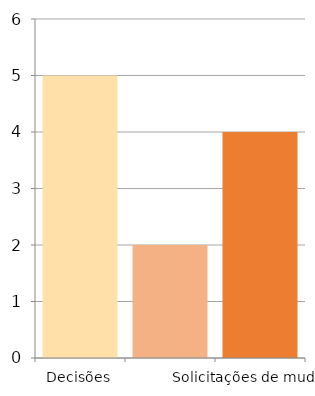
| Category | Series 0 |
|---|---|
| Decisões | 5 |
| Ações | 2 |
| Solicitações de mudança  | 4 |